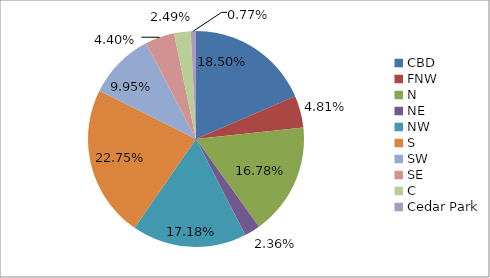
| Category | % |
|---|---|
| CBD | 0.185 |
| FNW | 0.048 |
| N  | 0.168 |
| NE | 0.024 |
| NW | 0.172 |
| S | 0.227 |
| SW | 0.1 |
| SE | 0.044 |
| C | 0.025 |
| Cedar Park | 0.008 |